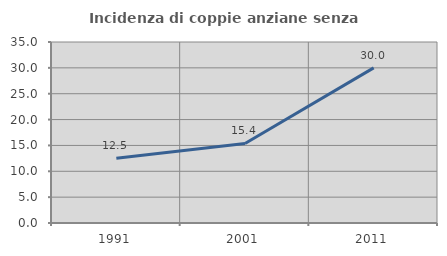
| Category | Incidenza di coppie anziane senza figli  |
|---|---|
| 1991.0 | 12.5 |
| 2001.0 | 15.385 |
| 2011.0 | 30 |